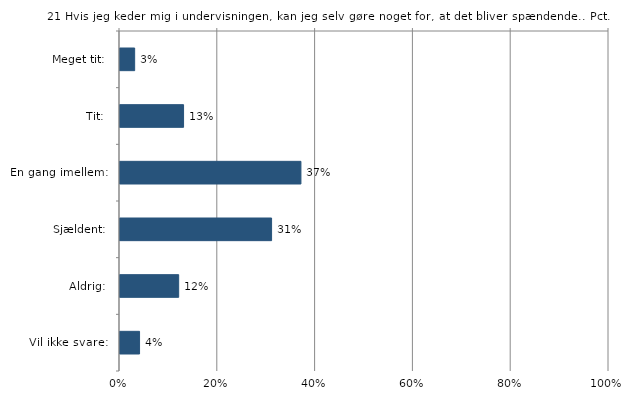
| Category | Hvis jeg keder mig i undervisningen, kan jeg selv gøre noget for, at det bliver spændende. |
|---|---|
| Meget tit:  | 0.03 |
| Tit:  | 0.13 |
| En gang imellem:  | 0.37 |
| Sjældent:  | 0.31 |
| Aldrig:  | 0.12 |
| Vil ikke svare:  | 0.04 |